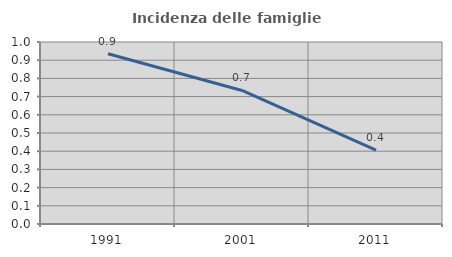
| Category | Incidenza delle famiglie numerose |
|---|---|
| 1991.0 | 0.935 |
| 2001.0 | 0.734 |
| 2011.0 | 0.407 |